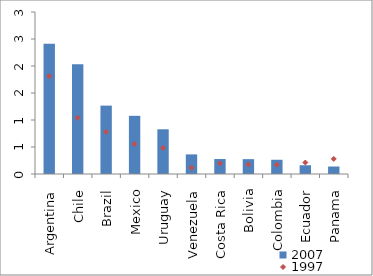
| Category | 2007 |
|---|---|
| Argentina | 2.413 |
| Chile | 2.032 |
| Brazil | 1.267 |
| Mexico | 1.077 |
| Uruguay | 0.828 |
| Venezuela | 0.363 |
| Costa Rica | 0.277 |
| Bolivia | 0.275 |
| Colombia | 0.264 |
| Ecuador | 0.162 |
| Panama | 0.138 |